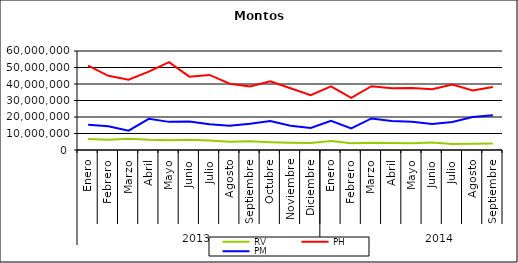
| Category | RV | PH | PM |
|---|---|---|---|
| 0 | 6603412.357 | 51097257.501 | 15291994.497 |
| 1 | 6144371.716 | 44938482.89 | 14418861.164 |
| 2 | 6870539.137 | 42574717.992 | 11735480.075 |
| 3 | 6139858.354 | 47535968.024 | 18924825.739 |
| 4 | 5890476.617 | 53273527.932 | 17047621.863 |
| 5 | 6142686.449 | 44450017.2 | 17254269.094 |
| 6 | 5792277.798 | 45481930.674 | 15546714.502 |
| 7 | 4962192.427 | 40196203.529 | 14644148.591 |
| 8 | 5244267.415 | 38549056.812 | 15946518.356 |
| 9 | 4723321.466 | 41614732.22 | 17536811.707 |
| 10 | 4437368.656 | 37439358.84 | 14761398.421 |
| 11 | 4226608.984 | 33178083.97 | 13384599.022 |
| 12 | 5420667.417 | 38592535.269 | 17738595.757 |
| 13 | 4106438.771 | 31549668.118 | 13082413.394 |
| 14 | 4333641.03 | 38643419.598 | 19107804.717 |
| 15 | 4275572.01 | 37358737.373 | 17555594.298 |
| 16 | 4139390.073 | 37637742.383 | 17146834.395 |
| 17 | 4553837.188 | 36763239.571 | 15771052.834 |
| 18 | 3703149.165 | 39606057.082 | 16994946.064 |
| 19 | 3782918.817 | 36051238.49 | 19934925.294 |
| 20 | 3865511.016 | 38158385.619 | 21028953.635 |